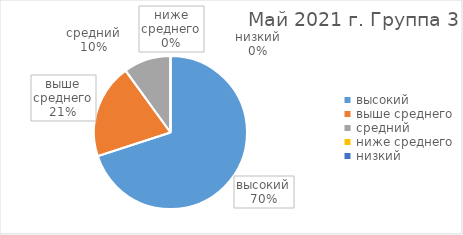
| Category | Series 0 |
|---|---|
| высокий | 7 |
| выше среднего | 2 |
| средний | 1 |
| ниже среднего | 0 |
| низкий | 0 |